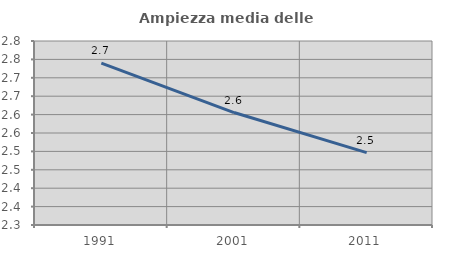
| Category | Ampiezza media delle famiglie |
|---|---|
| 1991.0 | 2.74 |
| 2001.0 | 2.606 |
| 2011.0 | 2.497 |